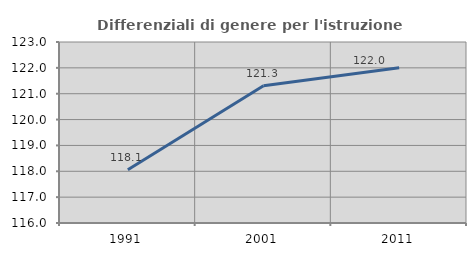
| Category | Differenziali di genere per l'istruzione superiore |
|---|---|
| 1991.0 | 118.058 |
| 2001.0 | 121.308 |
| 2011.0 | 122.008 |